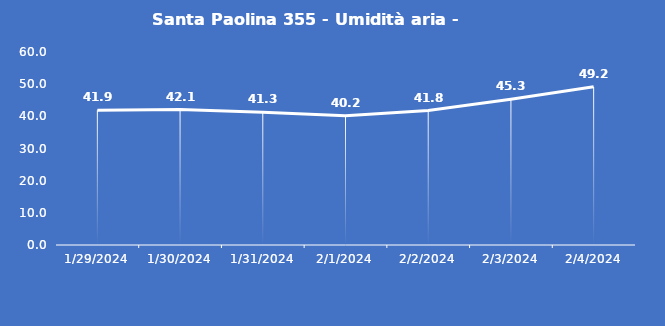
| Category | Santa Paolina 355 - Umidità aria - Grezzo (%) |
|---|---|
| 1/29/24 | 41.9 |
| 1/30/24 | 42.1 |
| 1/31/24 | 41.3 |
| 2/1/24 | 40.2 |
| 2/2/24 | 41.8 |
| 2/3/24 | 45.3 |
| 2/4/24 | 49.2 |